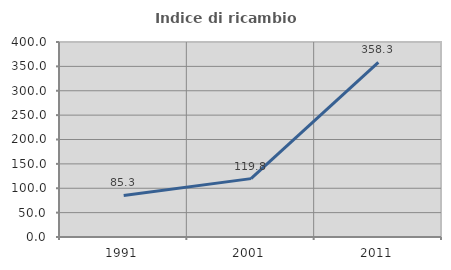
| Category | Indice di ricambio occupazionale  |
|---|---|
| 1991.0 | 85.283 |
| 2001.0 | 119.753 |
| 2011.0 | 358.333 |